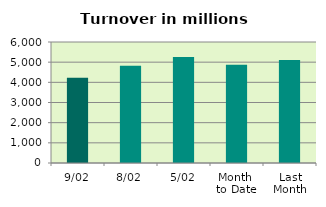
| Category | Series 0 |
|---|---|
| 9/02 | 4227.49 |
| 8/02 | 4825.173 |
| 5/02 | 5253.441 |
| Month 
to Date | 4868.734 |
| Last
Month | 5105.691 |